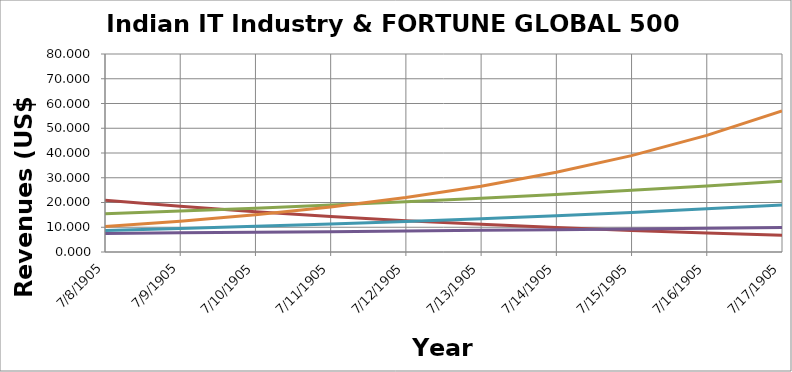
| Category | 500th Company in Fortune GLOBAL 500 | TCS | WIPRO | INFOSYS | COGNIZANT |
|---|---|---|---|---|---|
| 2016.0 | 20.923 | 15.454 | 7.503 | 8.711 | 10.262 |
| 2017.0 | 18.456 | 16.545 | 7.738 | 9.501 | 12.416 |
| 2018.0 | 16.28 | 17.713 | 7.98 | 10.363 | 15.022 |
| 2019.0 | 14.36 | 18.964 | 8.23 | 11.302 | 18.175 |
| 2020.0 | 12.667 | 20.302 | 8.488 | 12.327 | 21.99 |
| 2021.0 | 11.173 | 21.736 | 8.754 | 13.445 | 26.606 |
| 2022.0 | 9.856 | 23.27 | 9.028 | 14.665 | 32.191 |
| 2023.0 | 8.693 | 24.913 | 9.311 | 15.995 | 38.948 |
| 2024.0 | 7.668 | 26.672 | 9.603 | 17.445 | 47.123 |
| 2025.0 | 6.764 | 28.554 | 9.903 | 19.027 | 57.014 |